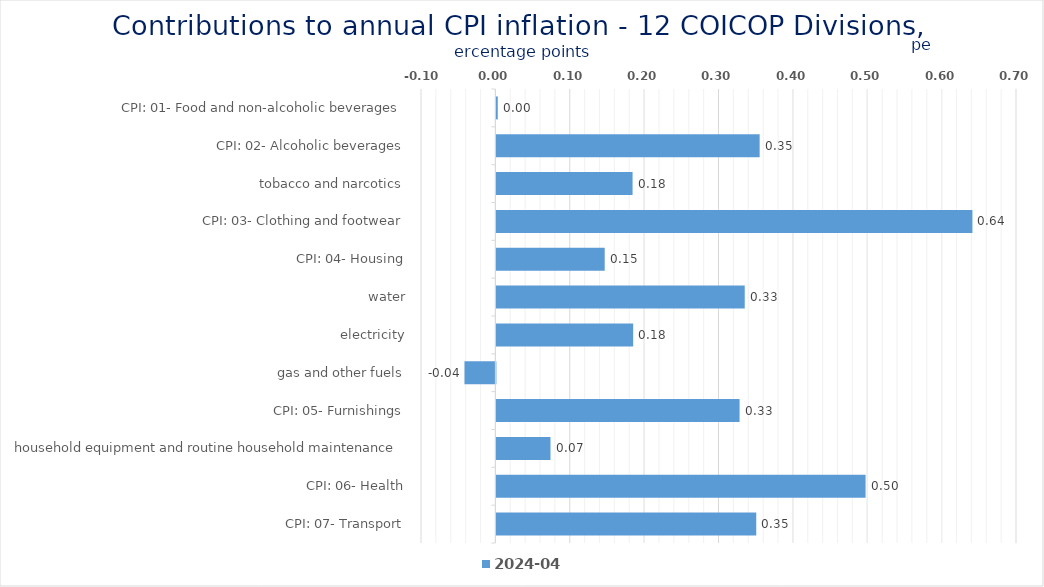
| Category | 2024-04 |
|---|---|
| CPI: 01- Food and non-alcoholic beverages | 0.002 |
| CPI: 02- Alcoholic beverages, tobacco and narcotics | 0.354 |
| CPI: 03- Clothing and footwear | 0.183 |
| CPI: 04- Housing, water, electricity, gas and other fuels | 0.64 |
| CPI: 05- Furnishings, household equipment and routine household maintenance | 0.146 |
| CPI: 06- Health | 0.334 |
| CPI: 07- Transport | 0.184 |
| CPI: 08- Communication | -0.042 |
| CPI: 09- Recreation and culture | 0.327 |
| CPI: 10- Education | 0.073 |
| CPI: 11- Restaurants and hotels | 0.496 |
| CPI: 12- Miscellaneous goods and services | 0.349 |